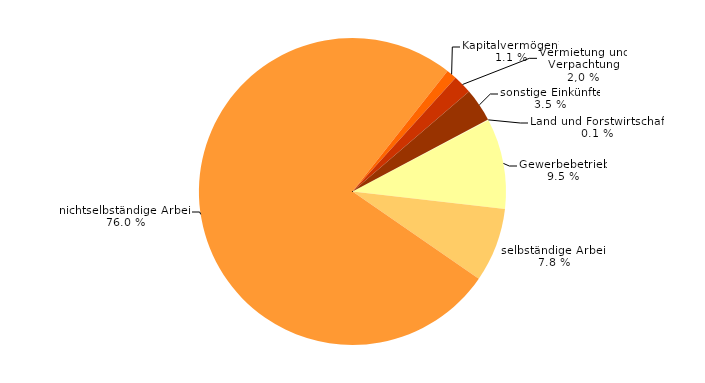
| Category | Series 0 |
|---|---|
| Land und Forstwirtschaft | 0.1 |
| Gewerbebetrieb | 9.5 |
| selbständige Arbeit | 7.8 |
| nichtselbständige Arbeit | 76 |
| Kapitalvermögen¹ | 1.1 |
| Vermietung und Verpachtung | 2 |
| sonstige Einkünfte | 3.5 |